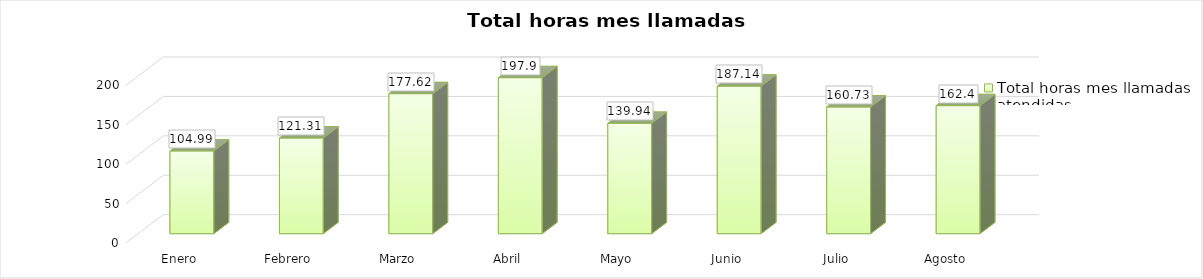
| Category | Total horas mes llamadas atendidas |
|---|---|
| Enero | 104.99 |
| Febrero | 121.31 |
| Marzo | 177.62 |
| Abril | 197.9 |
| Mayo | 139.94 |
| Junio | 187.14 |
| Julio | 160.73 |
| Agosto | 162.4 |